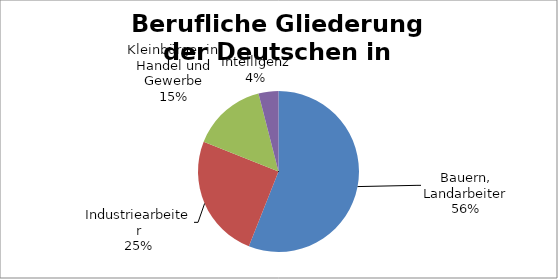
| Category | Series 0 |
|---|---|
| Bauern, Landarbeiter | 0.56 |
| Industriearbeiter | 0.25 |
| Kleinbürger in Handel und Gewerbe | 0.15 |
| Intelligenz | 0.04 |